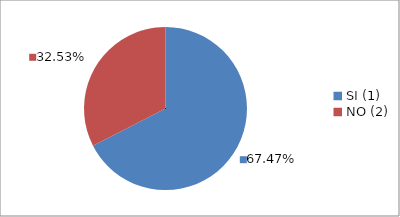
| Category | Series 0 |
|---|---|
| SI (1) | 0.675 |
| NO (2) | 0.325 |